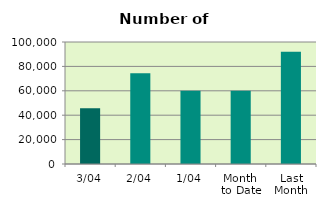
| Category | Series 0 |
|---|---|
| 3/04 | 45600 |
| 2/04 | 74432 |
| 1/04 | 60140 |
| Month 
to Date | 60057.333 |
| Last
Month | 92104.455 |